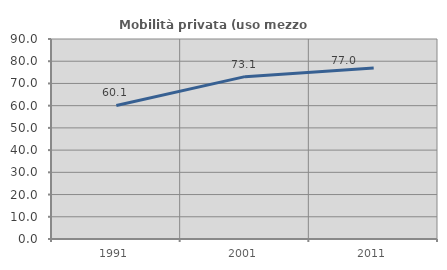
| Category | Mobilità privata (uso mezzo privato) |
|---|---|
| 1991.0 | 60.112 |
| 2001.0 | 73.067 |
| 2011.0 | 76.981 |